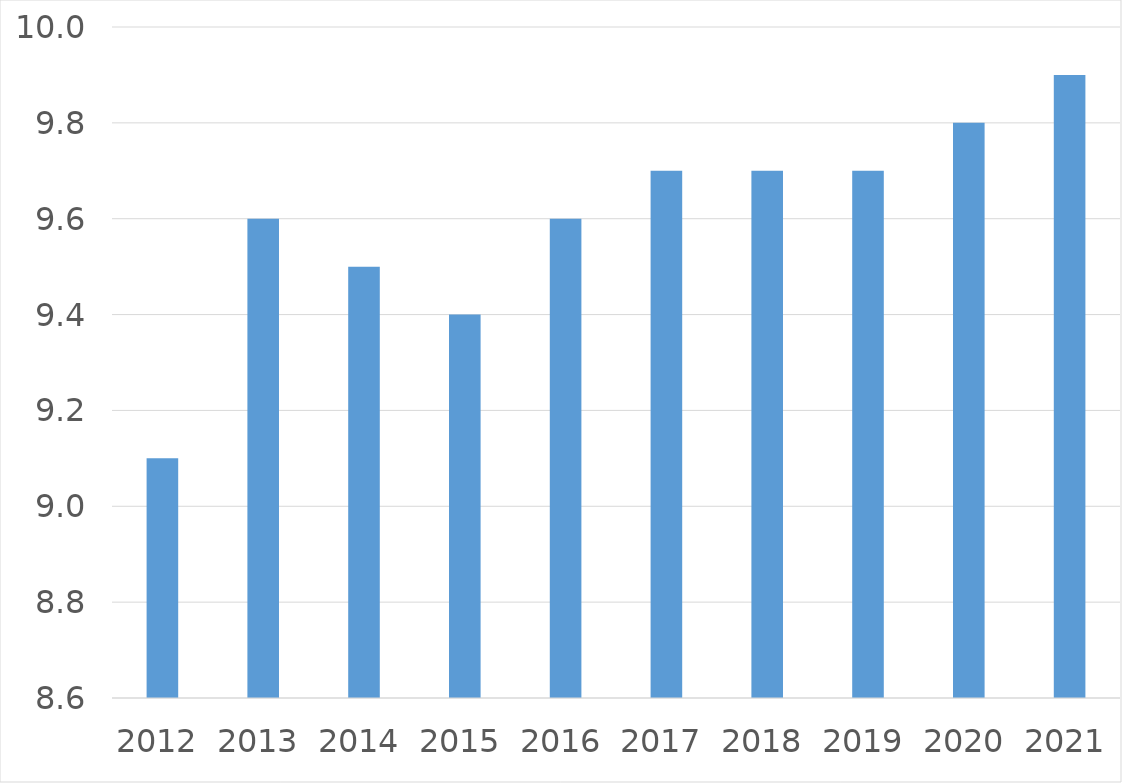
| Category | Series 0 |
|---|---|
| 2012 | 9.1 |
| 2013 | 9.6 |
| 2014 | 9.5 |
| 2015 | 9.4 |
| 2016 | 9.6 |
| 2017 | 9.7 |
| 2018 | 9.7 |
| 2019 | 9.7 |
| 2020 | 9.8 |
| 2021 | 9.9 |